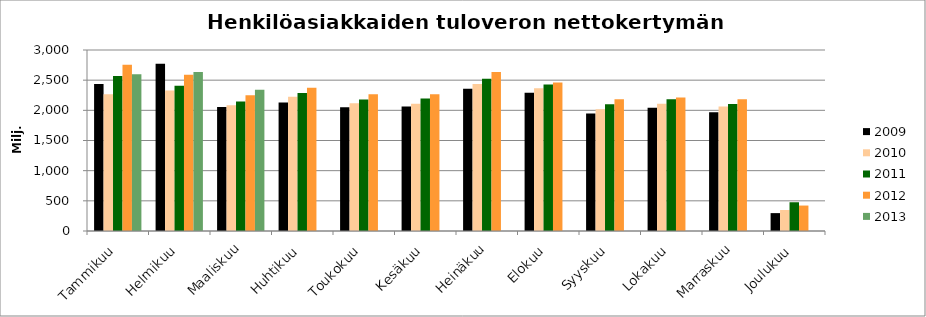
| Category | 2009 | 2010 | 2011 | 2012 | 2013 |
|---|---|---|---|---|---|
| Tammikuu | 2438.489 | 2267.873 | 2569.442 | 2754.468 | 2597.268 |
| Helmikuu | 2771.607 | 2330.409 | 2406.04 | 2591.616 | 2636.607 |
| Maaliskuu | 2054.852 | 2084.249 | 2145.291 | 2250.057 | 2340.316 |
| Huhtikuu | 2131.066 | 2225.487 | 2285.914 | 2375.631 | 0 |
| Toukokuu | 2051.558 | 2117.095 | 2177.688 | 2264.689 | 0 |
| Kesäkuu | 2063.182 | 2109.339 | 2194.481 | 2268.001 | 0 |
| Heinäkuu | 2357.008 | 2435.026 | 2524.383 | 2633.57 | 0 |
| Elokuu | 2289.863 | 2364.596 | 2427.052 | 2461.949 | 0 |
| Syyskuu | 1946.167 | 2019.118 | 2102.001 | 2184.152 | 0 |
| Lokakuu | 2041.676 | 2107.95 | 2185.045 | 2211.144 | 0 |
| Marraskuu | 1967.798 | 2063.457 | 2106.752 | 2183.43 | 0 |
| Joulukuu | 296.354 | 347.927 | 476.484 | 421.857 | 0 |